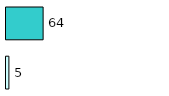
| Category | Series 0 | Series 1 |
|---|---|---|
| 0 | 5 | 64 |